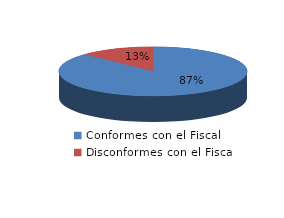
| Category | Series 0 |
|---|---|
| 0 | 34 |
| 1 | 5 |